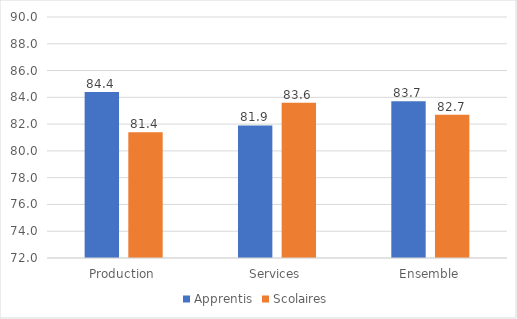
| Category | Apprentis | Scolaires |
|---|---|---|
| Production | 84.4 | 81.4 |
| Services | 81.9 | 83.6 |
| Ensemble | 83.7 | 82.7 |